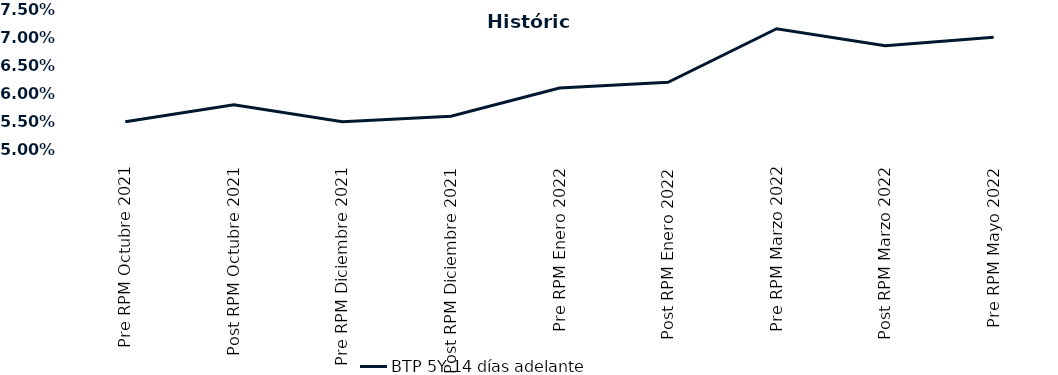
| Category | BTP 5Y 14 días adelante |
|---|---|
| Pre RPM Octubre 2021 | 0.055 |
| Post RPM Octubre 2021 | 0.058 |
| Pre RPM Diciembre 2021 | 0.055 |
| Post RPM Diciembre 2021 | 0.056 |
| Pre RPM Enero 2022 | 0.061 |
| Post RPM Enero 2022 | 0.062 |
| Pre RPM Marzo 2022 | 0.072 |
| Post RPM Marzo 2022 | 0.068 |
| Pre RPM Mayo 2022 | 0.07 |